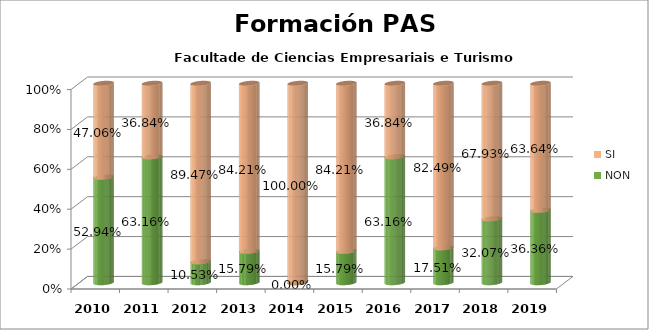
| Category | NON | SI |
|---|---|---|
| 2010.0 | 0.529 | 0.471 |
| 2011.0 | 0.632 | 0.368 |
| 2012.0 | 0.105 | 0.895 |
| 2013.0 | 0.158 | 0.842 |
| 2014.0 | 0 | 1 |
| 2015.0 | 0.158 | 0.842 |
| 2016.0 | 0.632 | 0.368 |
| 2017.0 | 0.175 | 0.825 |
| 2018.0 | 0.321 | 0.679 |
| 2019.0 | 0.364 | 0.636 |